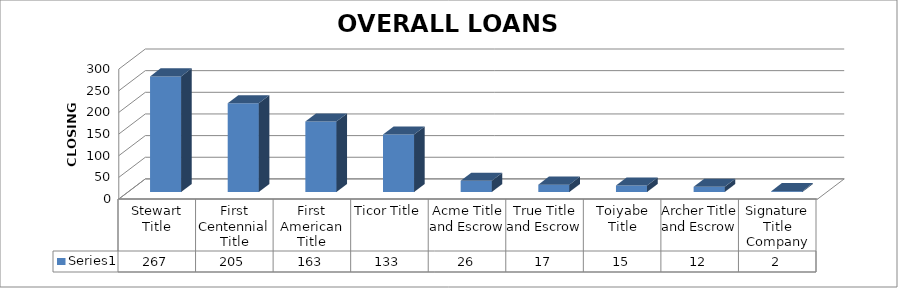
| Category | Series 0 |
|---|---|
| Stewart Title | 267 |
| First Centennial Title | 205 |
| First American Title | 163 |
| Ticor Title | 133 |
| Acme Title and Escrow | 26 |
| True Title and Escrow | 17 |
| Toiyabe Title | 15 |
| Archer Title and Escrow | 12 |
| Signature Title Company | 2 |